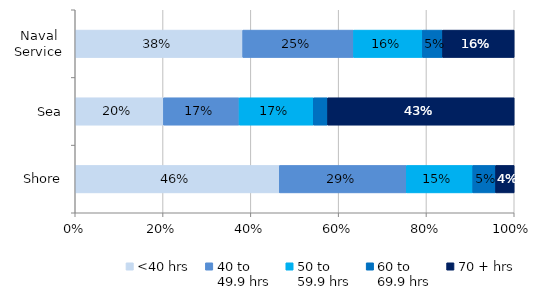
| Category | <40 hrs | 40 to 
49.9 hrs | 50 to 
59.9 hrs | 60 to 
69.9 hrs | 70 + hrs |
|---|---|---|---|---|---|
| Naval Service | 0.382 | 0.252 | 0.157 | 0.046 | 0.163 |
| Sea | 0.201 | 0.172 | 0.169 | 0.033 | 0.425 |
| Shore | 0.465 | 0.289 | 0.151 | 0.052 | 0.042 |